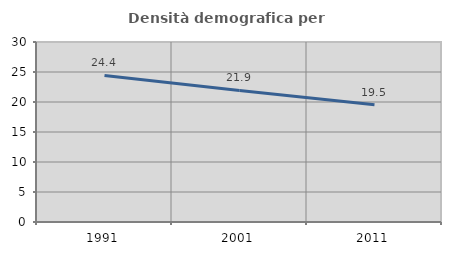
| Category | Densità demografica |
|---|---|
| 1991.0 | 24.436 |
| 2001.0 | 21.919 |
| 2011.0 | 19.542 |